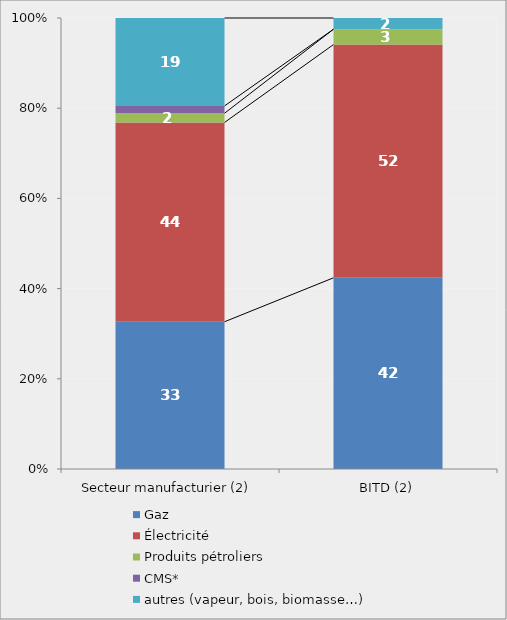
| Category | Gaz | Électricité | Produits pétroliers | CMS* | autres (vapeur, bois, biomasse…) |
|---|---|---|---|---|---|
| Secteur manufacturier (2) | 32.645 | 44.191 | 2.041 | 1.632 | 19.492 |
| BITD (2) | 42.392 | 51.717 | 3.402 | 0 | 2.49 |